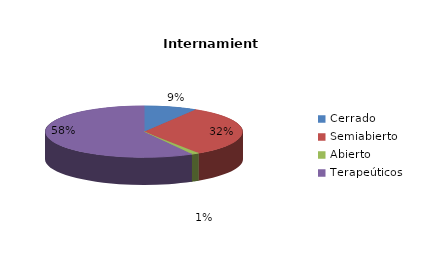
| Category | Series 0 |
|---|---|
| Cerrado | 7 |
| Semiabierto | 26 |
| Abierto | 1 |
| Terapeúticos | 47 |